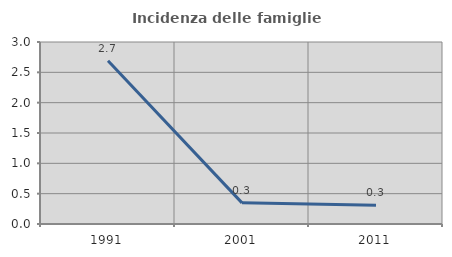
| Category | Incidenza delle famiglie numerose |
|---|---|
| 1991.0 | 2.692 |
| 2001.0 | 0.348 |
| 2011.0 | 0.308 |